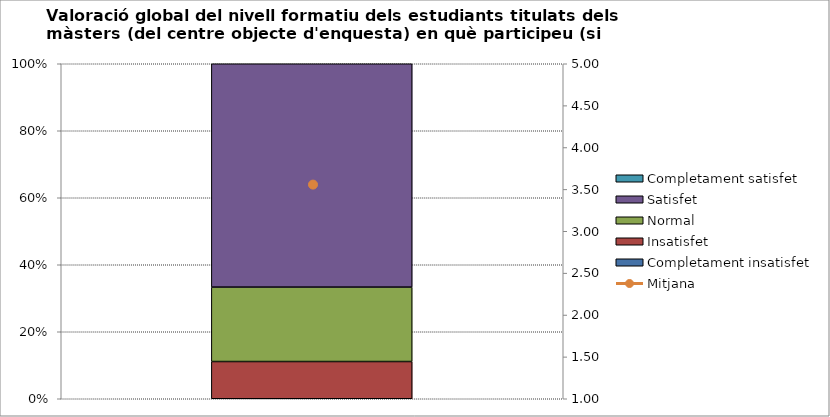
| Category | Completament insatisfet | Insatisfet | Normal | Satisfet | Completament satisfet |
|---|---|---|---|---|---|
| 0 | 0 | 1 | 2 | 6 | 0 |